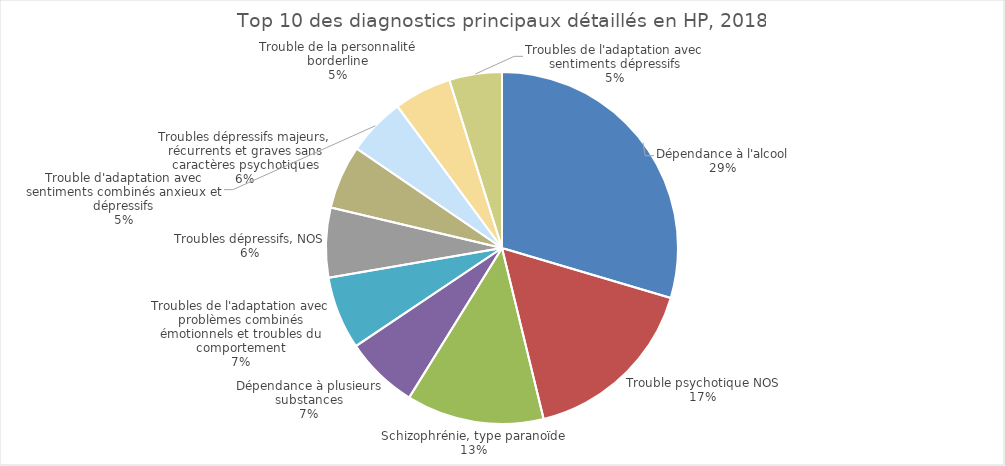
| Category | Fréquence |
|---|---|
| Dépendance à l'alcool | 7502 |
| Trouble psychotique NOS | 4215 |
| Schizophrénie, type paranoïde | 3207 |
| Dépendance à plusieurs substances | 1711 |
| Troubles de l'adaptation avec problèmes combinés émotionnels et troubles du comportement | 1700 |
| Troubles dépressifs, NOS | 1625 |
| Troubles dépressifs majeurs, récurrents et graves sans caractères psychotiques | 1487 |
| Trouble d'adaptation avec sentiments combinés anxieux et dépressifs | 1350 |
| Trouble de la personnalité borderline | 1340 |
| Troubles de l'adaptation avec sentiments dépressifs | 1227 |